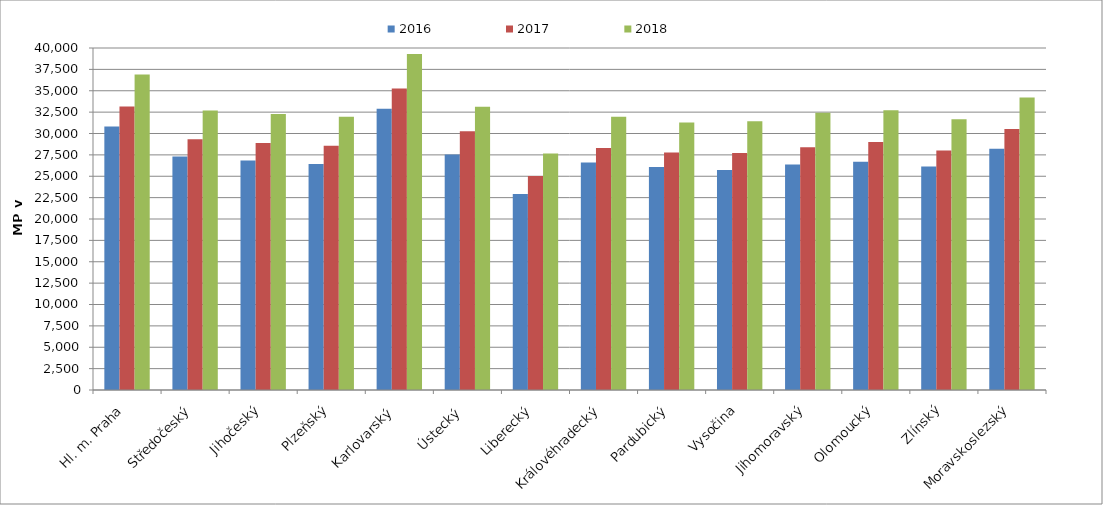
| Category | 2016 | 2017 | 2018 |
|---|---|---|---|
| Hl. m. Praha | 30808.855 | 33148.1 | 36912.451 |
| Středočeský | 27299.916 | 29324.053 | 32700.127 |
| Jihočeský | 26854.909 | 28875.565 | 32293.653 |
| Plzeňský | 26434.608 | 28566.538 | 31966.021 |
| Karlovarský  | 32887.252 | 35274.309 | 39295.739 |
| Ústecký   | 27540.601 | 30270.99 | 33119.967 |
| Liberecký | 22921.266 | 25023.481 | 27656.836 |
| Královéhradecký | 26595.555 | 28311.877 | 31967.315 |
| Pardubický | 26088.948 | 27787.624 | 31298.37 |
| Vysočina | 25745.311 | 27710.594 | 31420.93 |
| Jihomoravský | 26378.006 | 28389.935 | 32424.23 |
| Olomoucký | 26704.857 | 28991.882 | 32709.258 |
| Zlínský | 26128.706 | 28015.681 | 31670.294 |
| Moravskoslezský | 28205.556 | 30538.227 | 34202.209 |